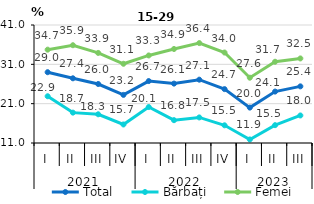
| Category | Total | Bărbați | Femei |
|---|---|---|---|
| 0 | 28.999 | 22.886 | 34.731 |
| 1 | 27.448 | 18.722 | 35.856 |
| 2 | 26 | 18.3 | 33.9 |
| 3 | 23.232 | 15.71 | 31.142 |
| 4 | 26.744 | 20.142 | 33.259 |
| 5 | 26.1 | 16.8 | 34.9 |
| 6 | 27.1 | 17.5 | 36.4 |
| 7 | 24.7 | 15.5 | 34 |
| 8 | 20 | 11.9 | 27.6 |
| 9 | 24.074 | 15.537 | 31.654 |
| 10 | 25.4 | 18 | 32.5 |